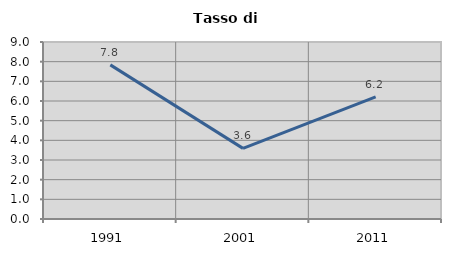
| Category | Tasso di disoccupazione   |
|---|---|
| 1991.0 | 7.838 |
| 2001.0 | 3.591 |
| 2011.0 | 6.21 |